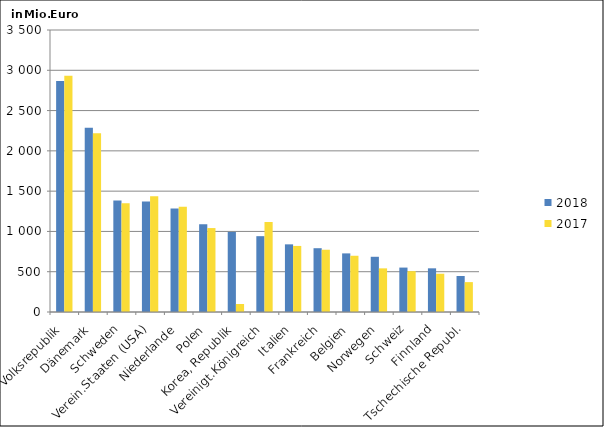
| Category | 2018 | 2017 |
|---|---|---|
| China, Volksrepublik | 2867.313 | 2930.659 |
| Dänemark | 2287.561 | 2219.121 |
| Schweden | 1385.053 | 1351.131 |
| Verein.Staaten (USA) | 1372.133 | 1438.031 |
| Niederlande | 1285.83 | 1306.349 |
| Polen | 1087.61 | 1041.683 |
| Korea, Republik | 993.957 | 99.667 |
| Vereinigt.Königreich | 941.129 | 1117.327 |
| Italien | 839.654 | 819.938 |
| Frankreich | 791.73 | 772.734 |
| Belgien | 727.431 | 697.989 |
| Norwegen | 685.334 | 541.658 |
| Schweiz | 551.35 | 507.05 |
| Finnland | 542.108 | 475.002 |
| Tschechische Republ. | 446.871 | 370.885 |